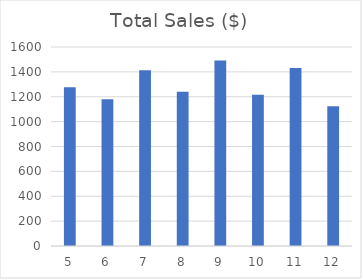
| Category | Total Sales ($) |
|---|---|
| 5.0 | 1277 |
| 6.0 | 1180 |
| 7.0 | 1414 |
| 8.0 | 1240 |
| 9.0 | 1492 |
| 10.0 | 1217 |
| 11.0 | 1432 |
| 12.0 | 1124 |